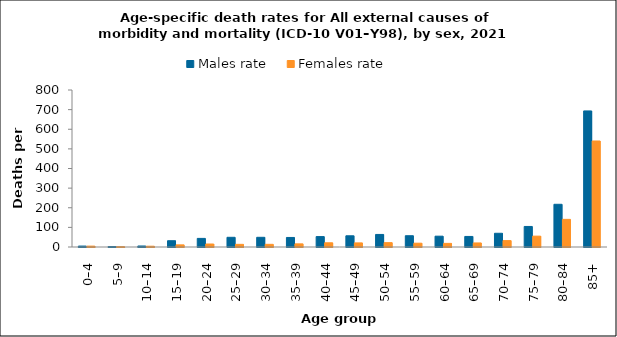
| Category | Males rate | Females rate |
|---|---|---|
| 0–4 | 4.766 | 4.498 |
| 5–9 | 2.285 | 1.783 |
| 10–14 | 5.147 | 4.059 |
| 15–19 | 32.02 | 10.87 |
| 20–24 | 43.841 | 15.262 |
| 25–29 | 49.433 | 13.501 |
| 30–34 | 49.44 | 13.554 |
| 35–39 | 48.586 | 15.972 |
| 40–44 | 53.071 | 21.464 |
| 45–49 | 57.139 | 20.895 |
| 50–54 | 63.967 | 22.143 |
| 55–59 | 57.44 | 19.417 |
| 60–64 | 55.119 | 18.439 |
| 65–69 | 53.762 | 20.676 |
| 70–74 | 69.949 | 32.597 |
| 75–79 | 104.682 | 55.323 |
| 80–84 | 217.633 | 140.804 |
| 85+ | 693.43 | 540.187 |